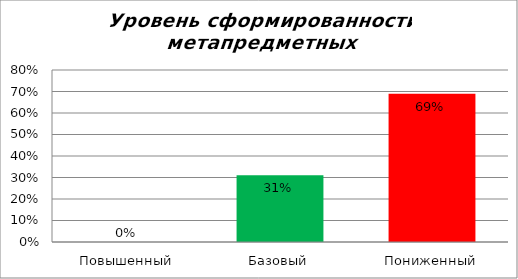
| Category | Уровень сформированности метапредметных результатов |
|---|---|
| Повышенный | 0 |
| Базовый | 0.31 |
| Пониженный | 0.69 |